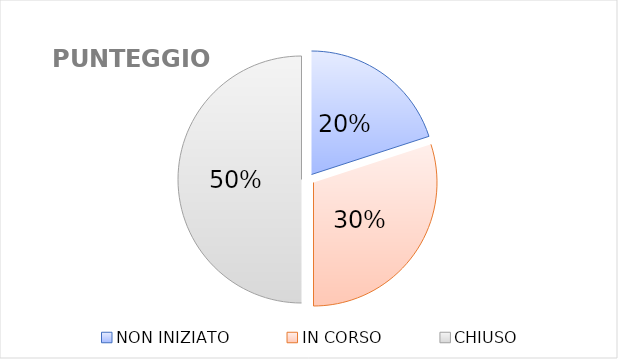
| Category | Series 0 |
|---|---|
| NON INIZIATO | 2 |
| IN CORSO | 3 |
| CHIUSO | 5 |